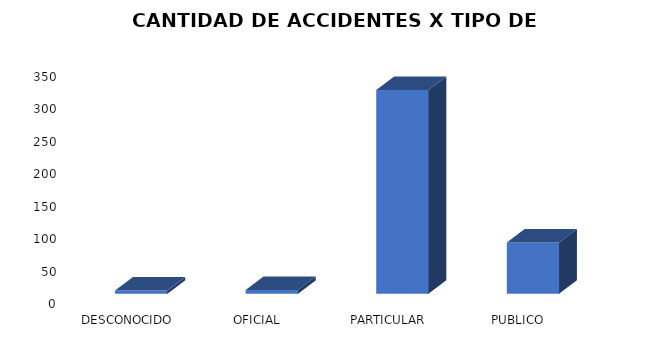
| Category | Total |
|---|---|
| DESCONOCIDO | 5 |
| OFICIAL | 6 |
| PARTICULAR | 314 |
| PUBLICO | 79 |